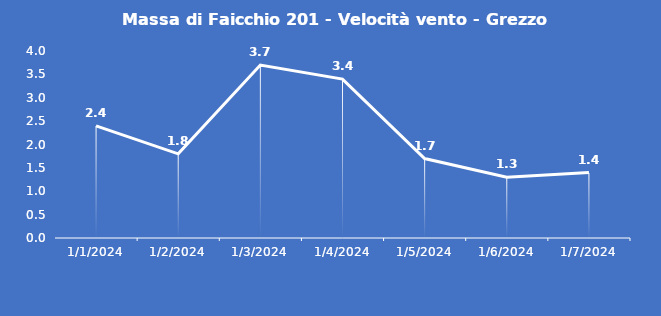
| Category | Massa di Faicchio 201 - Velocità vento - Grezzo (m/s) |
|---|---|
| 1/1/24 | 2.4 |
| 1/2/24 | 1.8 |
| 1/3/24 | 3.7 |
| 1/4/24 | 3.4 |
| 1/5/24 | 1.7 |
| 1/6/24 | 1.3 |
| 1/7/24 | 1.4 |